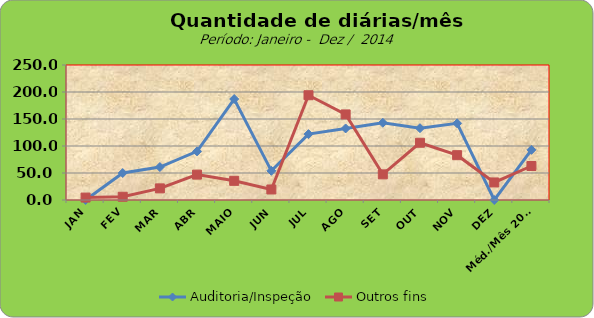
| Category | Auditoria/Inspeção | Outros fins |
|---|---|---|
| JAN | 0 | 4.5 |
| FEV | 50 | 6 |
| MAR | 61 | 21.5 |
| ABR | 90 | 47 |
| MAIO | 187 | 35.5 |
| JUN | 54 | 19.5 |
| JUL | 122 | 194 |
| AGO | 132.5 | 158.5 |
| SET | 143 | 47.5 |
| OUT | 133 | 106 |
| NOV | 142 | 83 |
| DEZ | 0 | 32.5 |
| Méd./Mês 2014 | 92.875 | 62.958 |